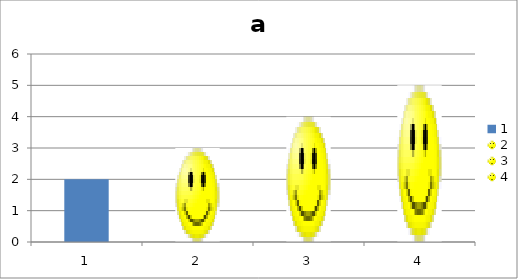
| Category | a |
|---|---|
| 0 | 2 |
| 1 | 3 |
| 2 | 4 |
| 3 | 5 |